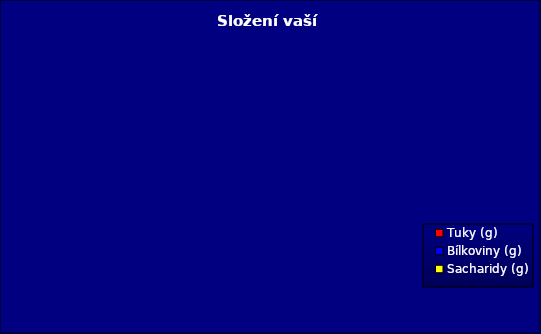
| Category | Složení stravy |
|---|---|
| Tuky (g) | 0 |
| Bílkoviny (g) | 0 |
| Sacharidy (g) | 0 |